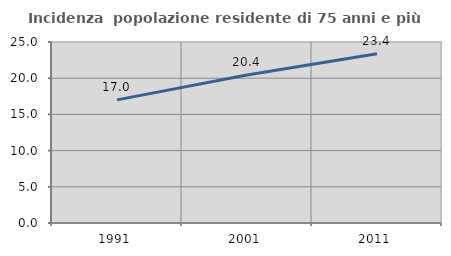
| Category | Incidenza  popolazione residente di 75 anni e più |
|---|---|
| 1991.0 | 17.007 |
| 2001.0 | 20.446 |
| 2011.0 | 23.364 |